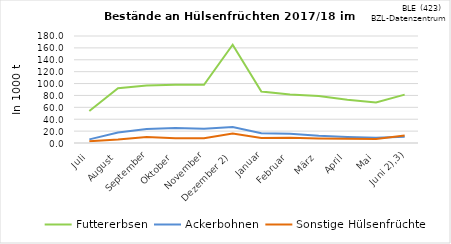
| Category | Futtererbsen | Ackerbohnen | Sonstige Hülsenfrüchte |
|---|---|---|---|
| Juli | 53.859 | 6.054 | 2.968 |
| August | 92.247 | 17.665 | 5.91 |
| September | 96.72 | 23.514 | 10.005 |
| Oktober | 98.163 | 25.397 | 8.027 |
| November | 97.954 | 23.787 | 8.099 |
|  Dezember 2) | 165.221 | 26.714 | 16.006 |
| Januar | 86.735 | 16.234 | 8.398 |
| Februar | 81.682 | 15.366 | 8.698 |
| März | 78.905 | 12.087 | 7.689 |
| April | 72.57 | 10.206 | 7.024 |
| Mai | 68.111 | 8.818 | 6.708 |
|    Juni 2),3) | 81.438 | 10.363 | 12.769 |